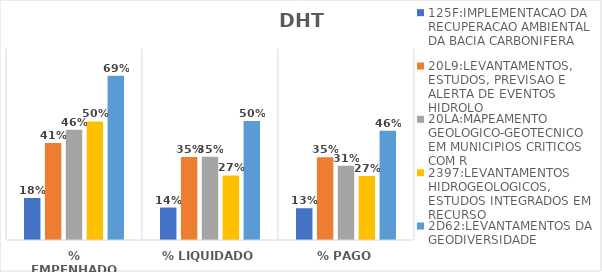
| Category | 125F:IMPLEMENTACAO DA RECUPERACAO AMBIENTAL DA BACIA CARBONIFERA | 20L9:LEVANTAMENTOS, ESTUDOS, PREVISAO E ALERTA DE EVENTOS HIDROLO | 20LA:MAPEAMENTO GEOLOGICO-GEOTECNICO EM MUNICIPIOS CRITICOS COM R | 2397:LEVANTAMENTOS HIDROGEOLOGICOS, ESTUDOS INTEGRADOS EM RECURSO | 2D62:LEVANTAMENTOS DA GEODIVERSIDADE |
|---|---|---|---|---|---|
| % EMPENHADO | 0.176 | 0.406 | 0.462 | 0.497 | 0.688 |
| % LIQUIDADO | 0.136 | 0.348 | 0.349 | 0.27 | 0.498 |
| % PAGO | 0.133 | 0.346 | 0.311 | 0.268 | 0.457 |